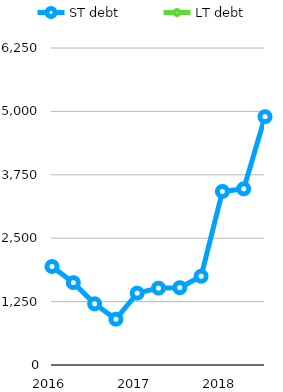
| Category | ST debt | LT debt |
|---|---|---|
| 2016 | 1942 |  |
|  | 1624 |  |
|  | 1207 |  |
|  | 903 |  |
| 2017 | 1417 |  |
|  | 1516 |  |
|  | 1525 |  |
|  | 1750 |  |
| 2018 | 3422 |  |
|  | 3473 |  |
|  | 4896 |  |